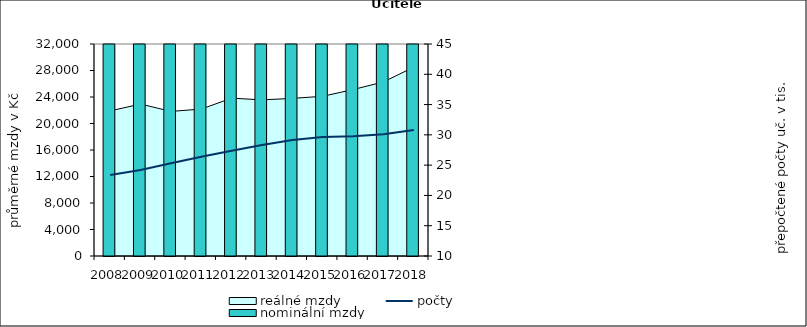
| Category | nominální mzdy |
|---|---|
| 2008.0 | 19866.166 |
| 2009.0 | 21036.65 |
| 2010.0 | 20298.604 |
| 2011.0 | 21024.77 |
| 2012.0 | 23326.585 |
| 2013.0 | 23398.844 |
| 2014.0 | 23720.195 |
| 2015.0 | 24108.013 |
| 2016.0 | 25299.673 |
| 2017.0 | 27088.588 |
| 2018.0 | 30020.6 |